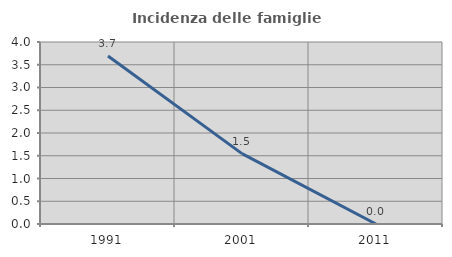
| Category | Incidenza delle famiglie numerose |
|---|---|
| 1991.0 | 3.691 |
| 2001.0 | 1.546 |
| 2011.0 | 0 |